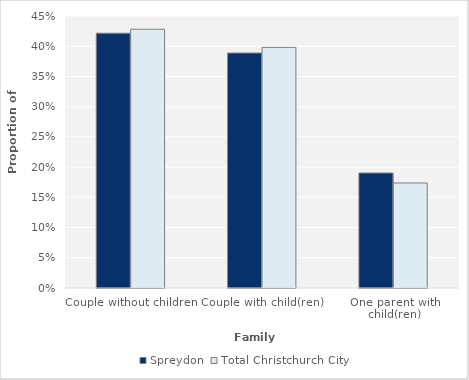
| Category | Spreydon | Total Christchurch City |
|---|---|---|
| Couple without children | 0.422 | 0.428 |
| Couple with child(ren) | 0.389 | 0.398 |
| One parent with child(ren) | 0.19 | 0.174 |